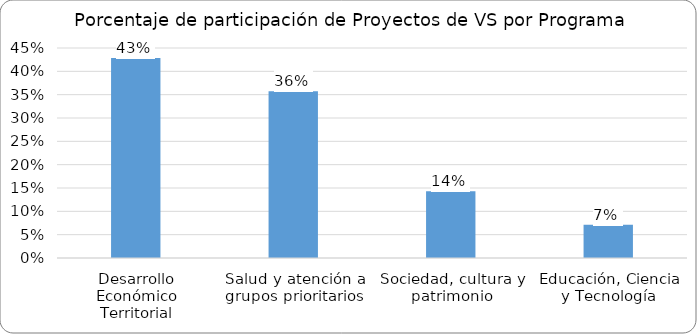
| Category | Series 0 |
|---|---|
| Desarrollo Económico Territorial | 0.429 |
| Salud y atención a grupos prioritarios | 0.357 |
| Sociedad, cultura y patrimonio | 0.143 |
| Educación, Ciencia y Tecnología | 0.071 |